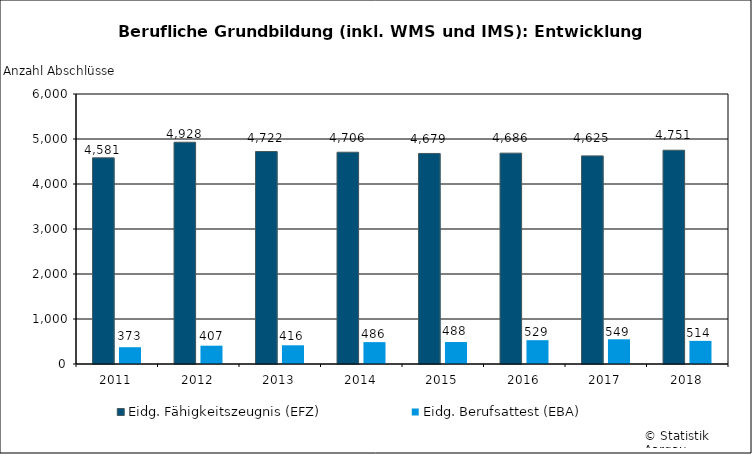
| Category | Eidg. Fähigkeitszeugnis (EFZ) | Eidg. Berufsattest (EBA) |
|---|---|---|
| 2011 | 4581 | 373 |
| 2012 | 4928 | 407 |
| 2013 | 4722 | 416 |
| 2014 | 4706 | 486 |
| 2015 | 4679 | 488 |
| 2016 | 4686 | 529 |
| 2017 | 4625 | 549 |
| 2018 | 4751 | 514 |